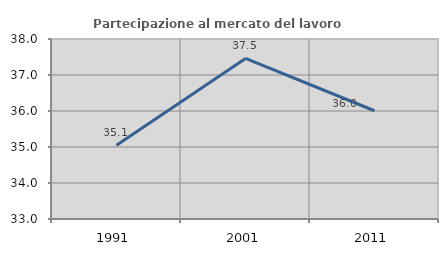
| Category | Partecipazione al mercato del lavoro  femminile |
|---|---|
| 1991.0 | 35.052 |
| 2001.0 | 37.459 |
| 2011.0 | 36.007 |